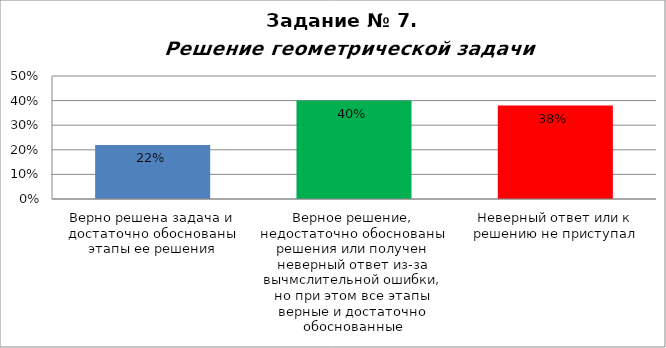
| Category | Решение геометрической задачи  |
|---|---|
| Верно решена задача и достаточно обоснованы этапы ее решения | 0.22 |
| Верное решение, недостаточно обоснованы решения или получен неверный ответ из-за вычмслительной ошибки, но при этом все этапы верные и достаточно обоснованные | 0.4 |
| Неверный ответ или к решению не приступал | 0.38 |